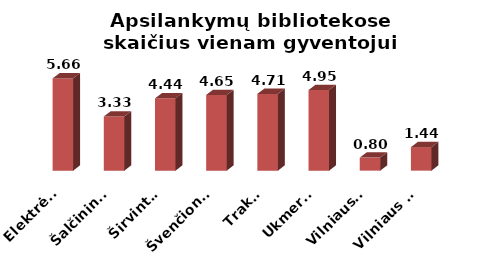
| Category | Series 0 |
|---|---|
|  Elektrėnai | 5.663 |
|  Šalčininkai | 3.327 |
|  Širvintos | 4.436 |
|  Švenčionys | 4.648 |
|  Trakai | 4.711 |
|  Ukmergė | 4.949 |
|  Vilniaus r. | 0.8 |
|  Vilniaus m. | 1.444 |